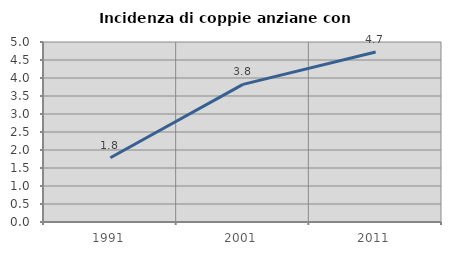
| Category | Incidenza di coppie anziane con figli |
|---|---|
| 1991.0 | 1.783 |
| 2001.0 | 3.823 |
| 2011.0 | 4.72 |